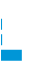
| Category | Series 0 |
|---|---|
| 0 | 0 |
| 1 | 0.002 |
| 2 | 0.007 |
| 3 | 0.991 |